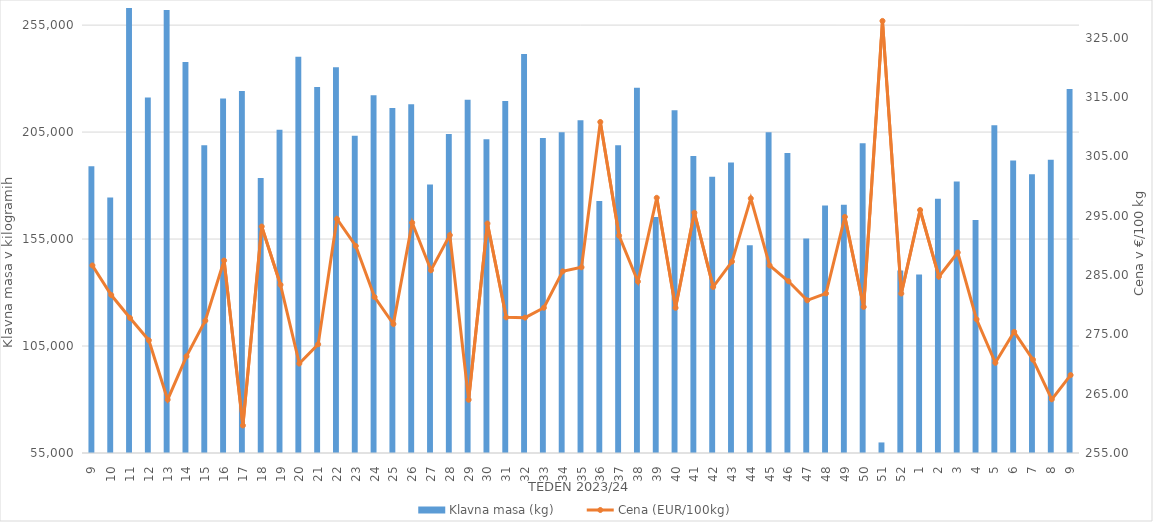
| Category | Klavna masa (kg) |
|---|---|
| 9.0 | 189006 |
| 10.0 | 174425 |
| 11.0 | 265476 |
| 12.0 | 221171 |
| 13.0 | 262102 |
| 14.0 | 237813 |
| 15.0 | 198828 |
| 16.0 | 220686 |
| 17.0 | 224192 |
| 18.0 | 183508 |
| 19.0 | 206133 |
| 20.0 | 240223 |
| 21.0 | 226050 |
| 22.0 | 235273 |
| 23.0 | 203306 |
| 24.0 | 222178 |
| 25.0 | 216259 |
| 26.0 | 218064 |
| 27.0 | 180556 |
| 28.0 | 204078 |
| 29.0 | 220162 |
| 30.0 | 201649 |
| 31.0 | 219538 |
| 32.0 | 241549 |
| 33.0 | 202261 |
| 34.0 | 204903 |
| 35.0 | 210575 |
| 36.0 | 172745 |
| 37.0 | 198877 |
| 38.0 | 225730 |
| 39.0 | 165273 |
| 40.0 | 215175 |
| 41.0 | 193769 |
| 42.0 | 184122 |
| 43.0 | 190834 |
| 44.0 | 152119 |
| 45.0 | 204974 |
| 46.0 | 195179 |
| 47.0 | 155300 |
| 48.0 | 170687 |
| 49.0 | 171040 |
| 50.0 | 199802 |
| 51.0 | 59936 |
| 52.0 | 140361 |
| 1.0 | 138450 |
| 2.0 | 173833 |
| 3.0 | 181907 |
| 4.0 | 163901 |
| 5.0 | 208207 |
| 6.0 | 191770 |
| 7.0 | 185347 |
| 8.0 | 192049 |
| 9.0 | 225097 |